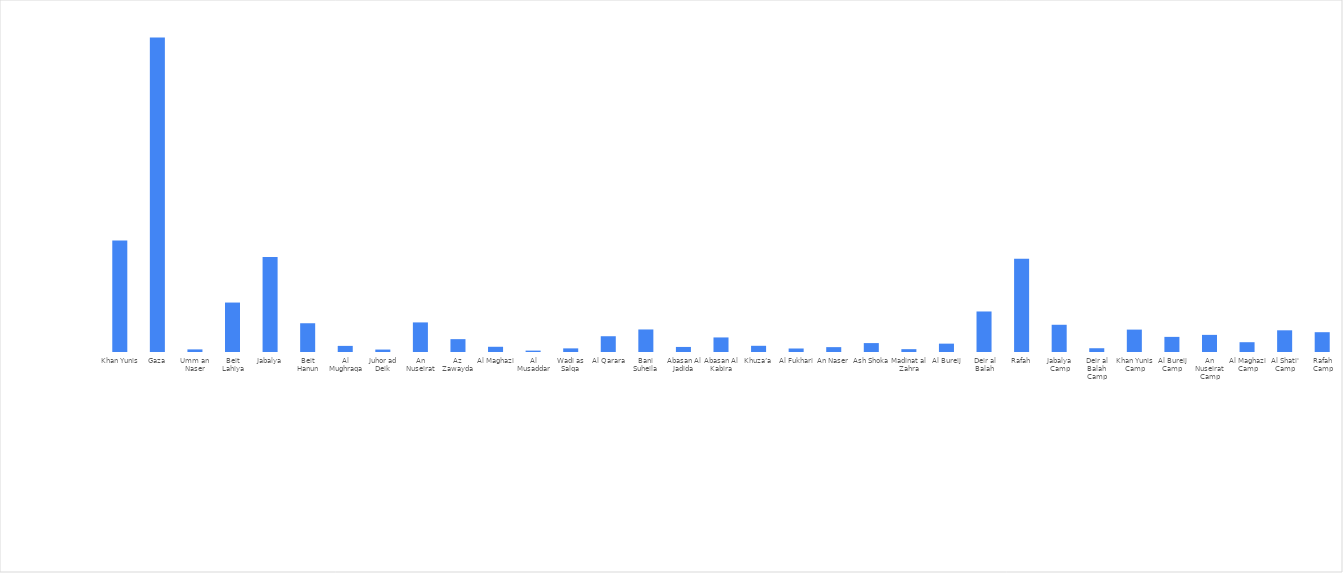
| Category | Series 0 |
|---|---|
| Khan Yunis | 228972 |
| Gaza | 645576 |
| Umm an Naser | 5352 |
| Beit Lahiya | 101507 |
| Jabalya | 195137 |
| Beit Hanun | 59022 |
| Al Mughraqa | 12527 |
| Juhor ad Deik | 5014 |
| An Nuseirat | 60735 |
| Az Zawayda | 26398 |
| Al Maghazi | 10707 |
| Al Musaddar | 2865 |
| Wadi as Salqa | 7435 |
| Al Qarara | 32376 |
| Bani Suheila | 46257 |
| Abasan Al Jadida | 10370 |
| Abasan Al Kabira | 29879 |
| Khuza’a | 12712 |
| Al Fukhari | 7192 |
| An Naser | 9992 |
| Ash Shoka | 18290 |
| Madinat al Zahra | 5836 |
| Al Bureij | 17153 |
| Deir al Balah | 83192 |
| Rafah | 191185 |
| Jabalya Camp | 55887 |
| Deir al Balah Camp | 7734 |
| Khan Yunis Camp | 45970 |
| Al Bureij Camp | 31030 |
| An Nuseirat Camp | 35153 |
| Al Maghazi Camp | 20105 |
| Al Shati' Camp | 44535 |
| Rafah Camp | 40651 |